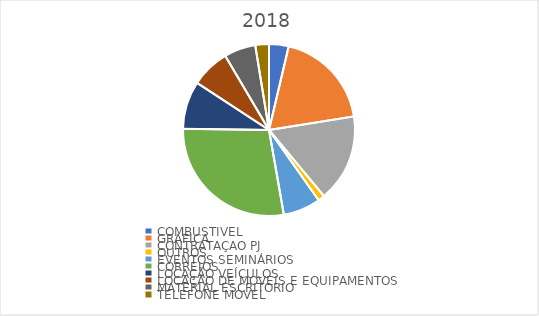
| Category | Series 0 |
|---|---|
| COMBUSTIVEL | 10588.56 |
| GRAFICA | 53911.87 |
| CONTRATAÇAO PJ | 47304 |
| OUTROS | 3599 |
| EVENTOS SEMINÁRIOS | 20182 |
| CORREIOS | 80406.42 |
| LOCAÇÃO VEÍCULOS | 25770.37 |
| LOCAÇÃO DE MOVEIS E EQUIPAMENTOS | 20932 |
| MATERIAL ESCRITORIO | 16991.41 |
| TELEFONE MOVEL | 7364.1 |